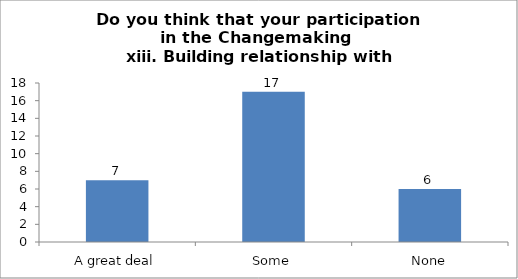
| Category | Do you think that your participation in the Changemaking 
 xiii. Building relationship with others. |
|---|---|
| A great deal | 7 |
| Some | 17 |
| None | 6 |